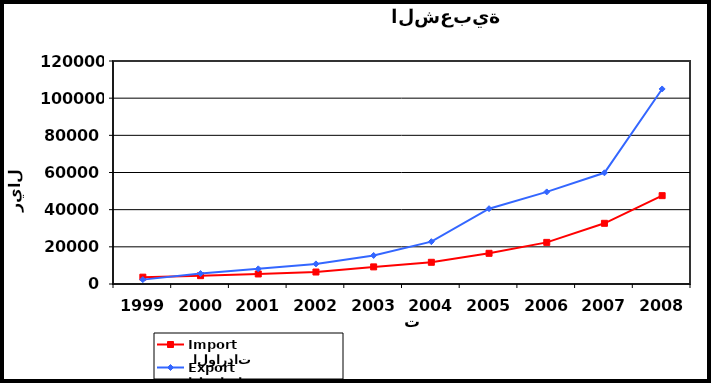
| Category |  الواردات           Import | الصادرات          Export |
|---|---|---|
| 1999.0 | 3677 | 2352 |
| 2000.0 | 4485 | 5630 |
| 2001.0 | 5403 | 8159 |
| 2002.0 | 6441 | 10820 |
| 2003.0 | 9211 | 15367 |
| 2004.0 | 11681 | 22787 |
| 2005.0 | 16521 | 40519 |
| 2006.0 | 22391 | 49556 |
| 2007.0 | 32664 | 59840 |
| 2008.0 | 47541 | 104954 |